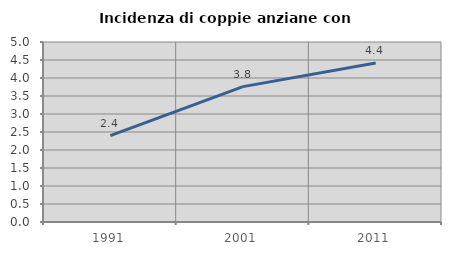
| Category | Incidenza di coppie anziane con figli |
|---|---|
| 1991.0 | 2.401 |
| 2001.0 | 3.76 |
| 2011.0 | 4.419 |